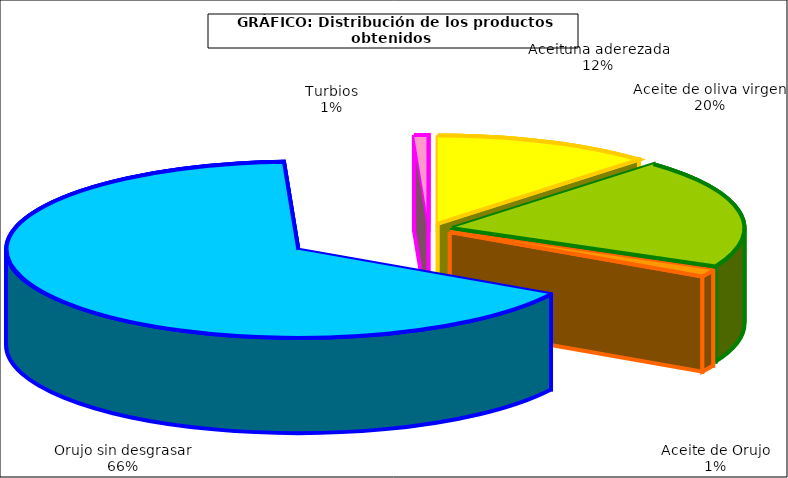
| Category | Series 1 |
|---|---|
| 0 | 404318 |
| 1 | 672103 |
| 2 | 41829 |
| 3 | 2203155 |
| 4 | 26398 |